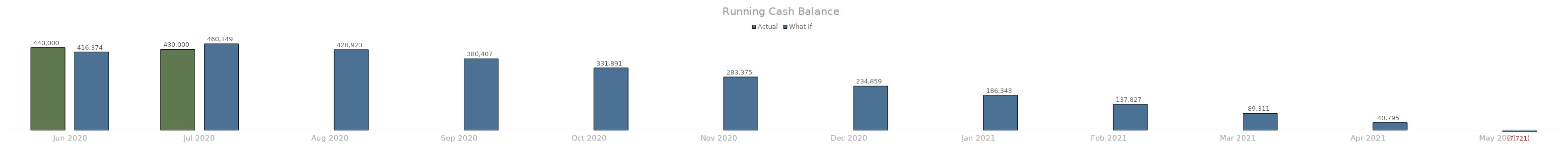
| Category | Actual | What If |
|---|---|---|
| Jun 2020 | 440000 | 416374.25 |
| Jul 2020 | 430000 | 460148.5 |
| Aug 2020 | 0 | 428922.75 |
| Sep 2020 | 0 | 380406.83 |
| Oct 2020 | 0 | 331890.91 |
| Nov 2020 | 0 | 283374.99 |
| Dec 2020 | 0 | 234859.07 |
| Jan 2021 | 0 | 186343.15 |
| Feb 2021 | 0 | 137827.23 |
| Mar 2021 | 0 | 89311.31 |
| Apr 2021 | 0 | 40795.39 |
| May 2021 | 0 | -7720.53 |